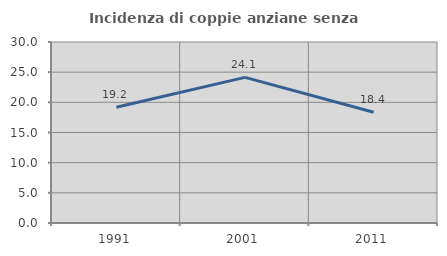
| Category | Incidenza di coppie anziane senza figli  |
|---|---|
| 1991.0 | 19.178 |
| 2001.0 | 24.138 |
| 2011.0 | 18.367 |